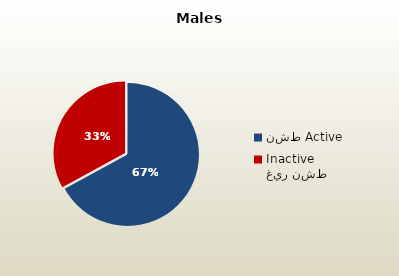
| Category | الذكور القطريين  Qatari Males |
|---|---|
| نشط Active | 69330 |
| غير نشط Inactive | 34093 |